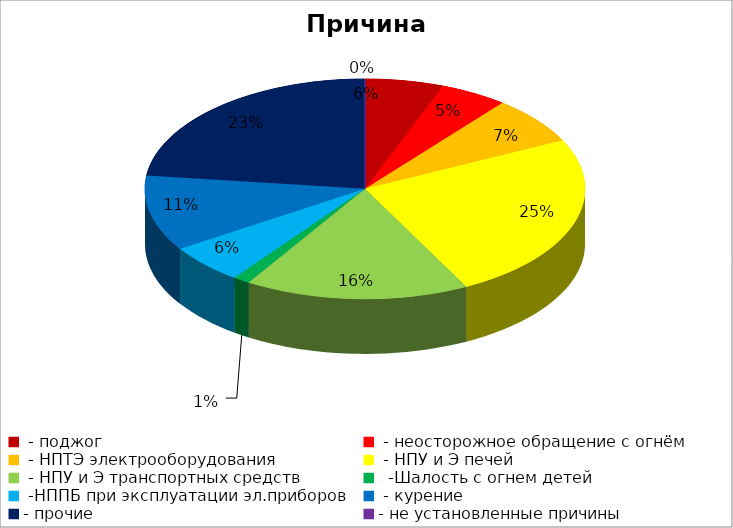
| Category | Причина пожара |
|---|---|
|  - поджог | 14 |
|  - неосторожное обращение с огнём | 12 |
|  - НПТЭ электрооборудования | 17 |
|  - НПУ и Э печей | 60 |
|  - НПУ и Э транспортных средств | 40 |
|   -Шалость с огнем детей | 3 |
|  -НППБ при эксплуатации эл.приборов | 14 |
|  - курение | 27 |
| - прочие | 56 |
| - не установленные причины | 0 |